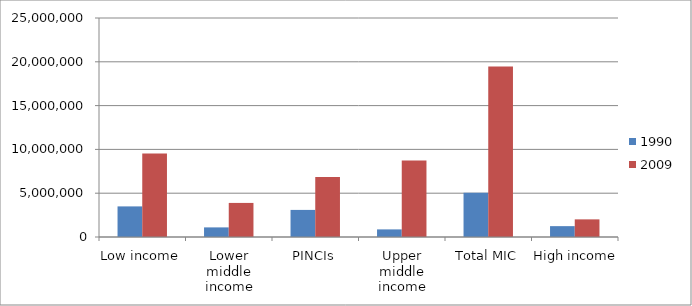
| Category | 1990 | 2009 |
|---|---|---|
| Low income | 3493600 | 9537700 |
| Lower middle income | 1096900 | 3890500 |
| PINCIs | 3092200 | 6848000 |
| Upper middle income | 868000 | 8735100 |
| Total MIC | 5057100 | 19473600 |
| High income | 1239700 | 2012600 |